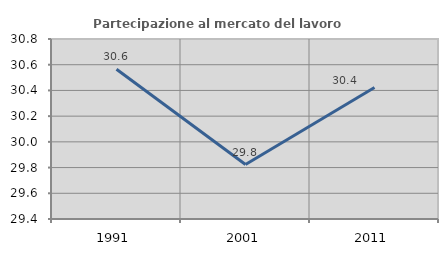
| Category | Partecipazione al mercato del lavoro  femminile |
|---|---|
| 1991.0 | 30.565 |
| 2001.0 | 29.823 |
| 2011.0 | 30.422 |